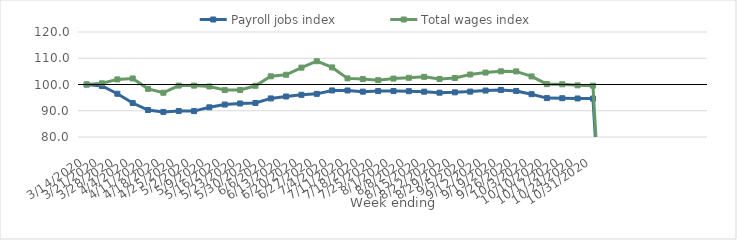
| Category | Payroll jobs index | Total wages index |
|---|---|---|
| 14/03/2020 | 100 | 100 |
| 21/03/2020 | 99.432 | 100.449 |
| 28/03/2020 | 96.475 | 101.943 |
| 04/04/2020 | 92.947 | 102.302 |
| 11/04/2020 | 90.28 | 98.341 |
| 18/04/2020 | 89.561 | 96.86 |
| 25/04/2020 | 89.881 | 99.579 |
| 02/05/2020 | 89.858 | 99.573 |
| 09/05/2020 | 91.306 | 99.239 |
| 16/05/2020 | 92.358 | 97.876 |
| 23/05/2020 | 92.763 | 97.893 |
| 30/05/2020 | 92.964 | 99.519 |
| 06/06/2020 | 94.696 | 103.121 |
| 13/06/2020 | 95.433 | 103.705 |
| 20/06/2020 | 96.069 | 106.427 |
| 27/06/2020 | 96.44 | 108.869 |
| 04/07/2020 | 97.73 | 106.506 |
| 11/07/2020 | 97.722 | 102.33 |
| 18/07/2020 | 97.276 | 102.069 |
| 25/07/2020 | 97.483 | 101.639 |
| 01/08/2020 | 97.503 | 102.255 |
| 08/08/2020 | 97.452 | 102.558 |
| 15/08/2020 | 97.264 | 102.918 |
| 22/08/2020 | 96.884 | 102.113 |
| 29/08/2020 | 97.011 | 102.472 |
| 05/09/2020 | 97.291 | 103.805 |
| 12/09/2020 | 97.691 | 104.553 |
| 19/09/2020 | 97.92 | 105.017 |
| 26/09/2020 | 97.543 | 104.997 |
| 03/10/2020 | 96.309 | 103.074 |
| 10/10/2020 | 94.82 | 100.128 |
| 17/10/2020 | 94.769 | 100.081 |
| 24/10/2020 | 94.678 | 99.679 |
| 31/10/2020 | 94.634 | 99.554 |